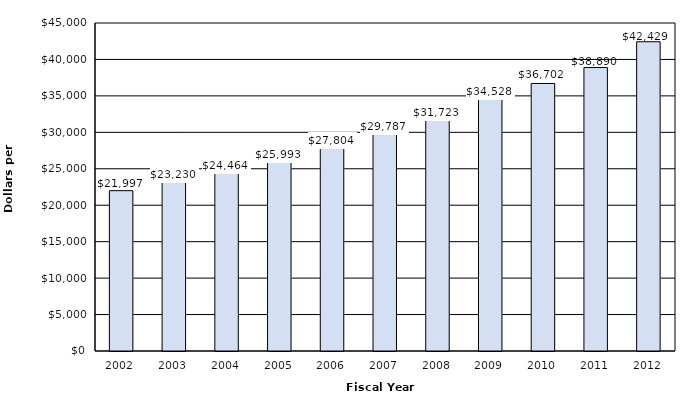
| Category | Tuition and Fees |
|---|---|
| 2002.0 | 21997 |
| 2003.0 | 23230 |
| 2004.0 | 24464 |
| 2005.0 | 25993 |
| 2006.0 | 27804 |
| 2007.0 | 29787 |
| 2008.0 | 31723 |
| 2009.0 | 34528 |
| 2010.0 | 36702 |
| 2011.0 | 38890 |
| 2012.0 | 42429 |